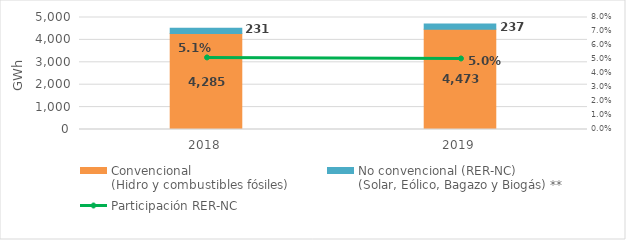
| Category | Convencional
(Hidro y combustibles fósiles) | No convencional (RER-NC)
(Solar, Eólico, Bagazo y Biogás) ** |
|---|---|---|
| 2018.0 | 4285.097 | 230.876 |
| 2019.0 | 4472.922 | 237.295 |